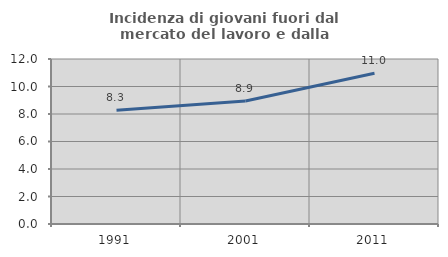
| Category | Incidenza di giovani fuori dal mercato del lavoro e dalla formazione  |
|---|---|
| 1991.0 | 8.275 |
| 2001.0 | 8.939 |
| 2011.0 | 10.963 |